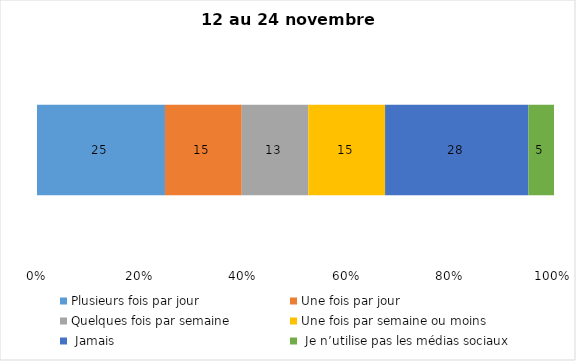
| Category | Plusieurs fois par jour | Une fois par jour | Quelques fois par semaine   | Une fois par semaine ou moins   |  Jamais   |  Je n’utilise pas les médias sociaux |
|---|---|---|---|---|---|---|
| 0 | 25 | 15 | 13 | 15 | 28 | 5 |